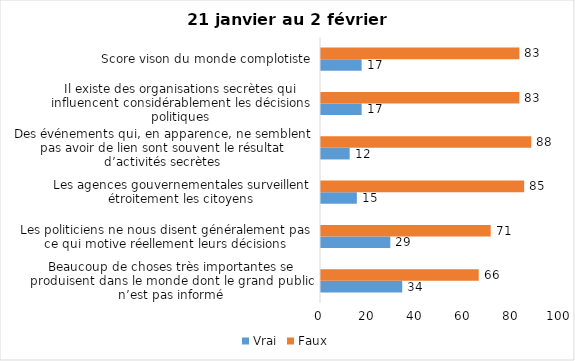
| Category | Vrai | Faux |
|---|---|---|
| Beaucoup de choses très importantes se produisent dans le monde dont le grand public n’est pas informé | 34 | 66 |
| Les politiciens ne nous disent généralement pas ce qui motive réellement leurs décisions | 29 | 71 |
| Les agences gouvernementales surveillent étroitement les citoyens | 15 | 85 |
| Des événements qui, en apparence, ne semblent pas avoir de lien sont souvent le résultat d’activités secrètes | 12 | 88 |
| Il existe des organisations secrètes qui influencent considérablement les décisions politiques | 17 | 83 |
| Score vison du monde complotiste | 17 | 83 |